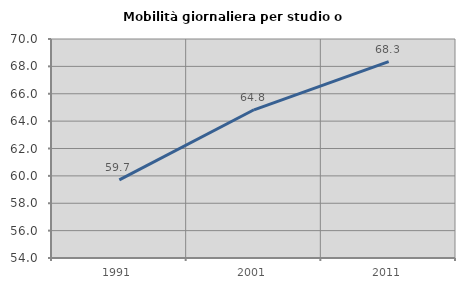
| Category | Mobilità giornaliera per studio o lavoro |
|---|---|
| 1991.0 | 59.707 |
| 2001.0 | 64.828 |
| 2011.0 | 68.343 |